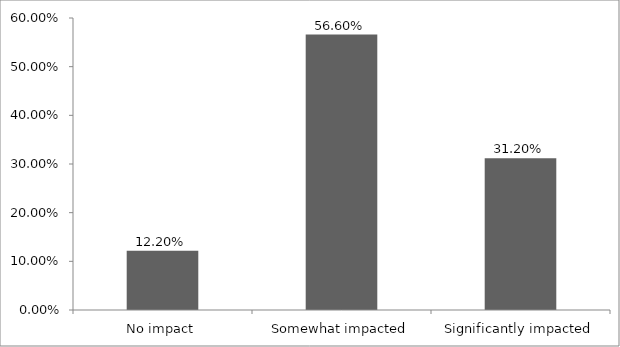
| Category | Series 0 |
|---|---|
| No impact | 0.122 |
| Somewhat impacted | 0.566 |
| Significantly impacted | 0.312 |